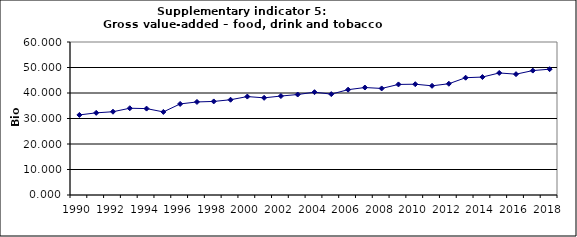
| Category | Gross value-added – food, drink and tobacco industry, Bio Euro (EC95) |
|---|---|
| 1990 | 31.397 |
| 1991 | 32.216 |
| 1992 | 32.659 |
| 1993 | 34.021 |
| 1994 | 33.881 |
| 1995 | 32.584 |
| 1996 | 35.716 |
| 1997 | 36.492 |
| 1998 | 36.694 |
| 1999 | 37.358 |
| 2000 | 38.598 |
| 2001 | 38.101 |
| 2002 | 38.802 |
| 2003 | 39.404 |
| 2004 | 40.323 |
| 2005 | 39.565 |
| 2006 | 41.299 |
| 2007 | 42.149 |
| 2008 | 41.786 |
| 2009 | 43.363 |
| 2010 | 43.445 |
| 2011 | 42.818 |
| 2012 | 43.629 |
| 2013 | 45.998 |
| 2014 | 46.251 |
| 2015 | 47.856 |
| 2016 | 47.386 |
| 2017 | 48.791 |
| 2018 | 49.344 |